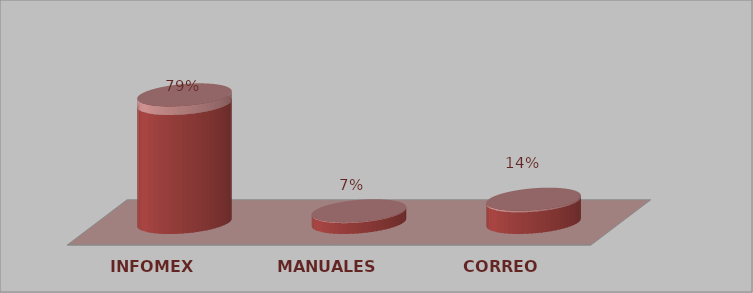
| Category | Series 0 | Series 1 |
|---|---|---|
| INFOMEX | 11 | 0.786 |
| MANUALES | 1 | 0.071 |
| CORREO | 2 | 0.143 |